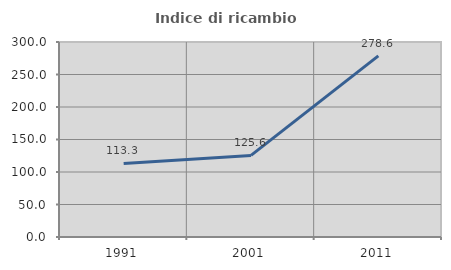
| Category | Indice di ricambio occupazionale  |
|---|---|
| 1991.0 | 113.258 |
| 2001.0 | 125.563 |
| 2011.0 | 278.598 |